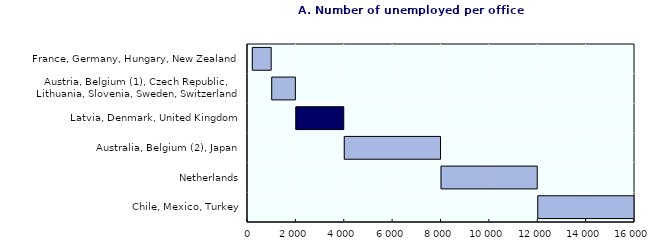
| Category | One | Two-one |
|---|---|---|
| Chile, Mexico, Turkey | 12001 | 12999 |
| Netherlands | 8001 | 3999 |
| Australia, Belgium (2), Japan | 4001 | 3999 |
| Latvia, Denmark, United Kingdom | 2001 | 1999 |
| Austria, Belgium (1), Czech Republic, 
Lithuania, Slovenia, Sweden, Switzerland | 1001 | 999 |
| France, Germany, Hungary, New Zealand | 200 | 800 |